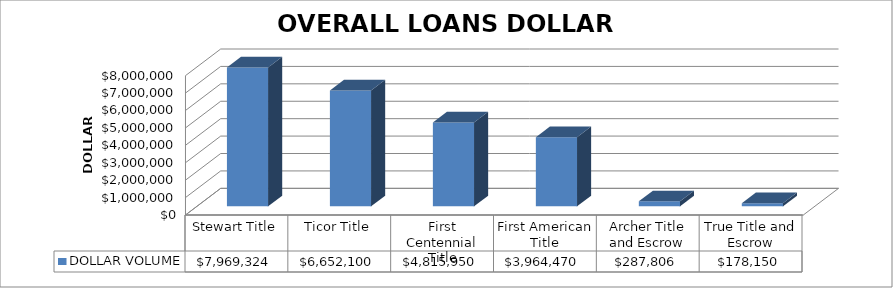
| Category | DOLLAR VOLUME |
|---|---|
| Stewart Title | 7969324 |
| Ticor Title | 6652100 |
| First Centennial Title | 4815950 |
| First American Title | 3964470 |
| Archer Title and Escrow | 287806 |
| True Title and Escrow | 178150 |